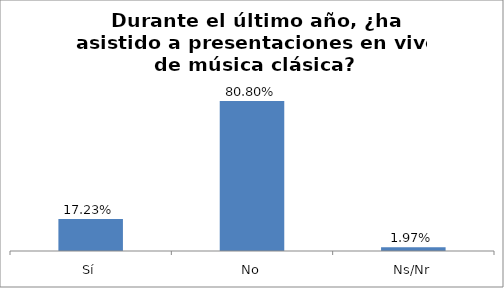
| Category | Total |
|---|---|
| Sí | 0.172 |
| No | 0.808 |
| Ns/Nr | 0.02 |